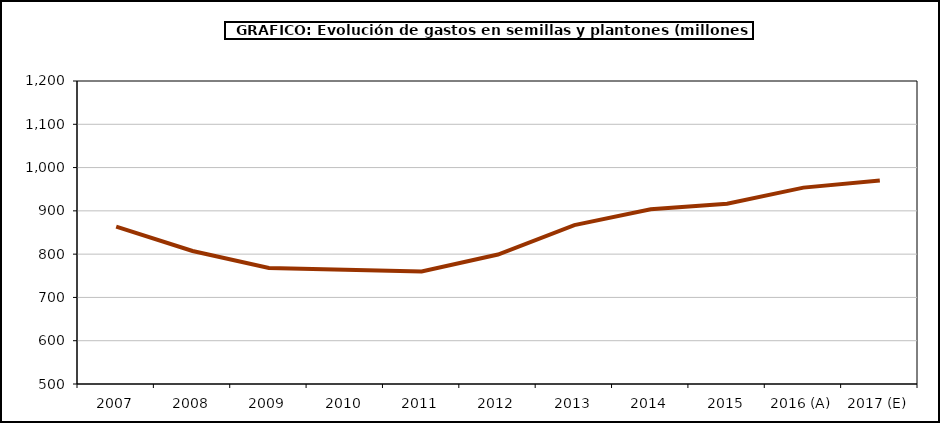
| Category | Semillas |
|---|---|
| 2007 | 863.62 |
| 2008 | 807.244 |
| 2009 | 768.186 |
| 2010 | 763.963 |
| 2011 | 759.736 |
| 2012 | 799.053 |
| 2013 | 867.097 |
| 2014 | 903.589 |
| 2015 | 916.393 |
| 2016 (A) | 953.663 |
| 2017 (E) | 970.261 |